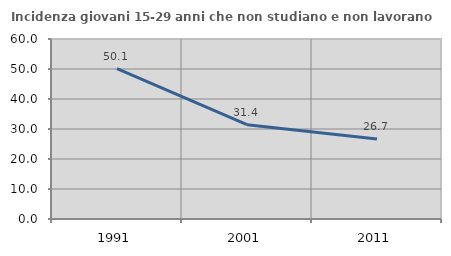
| Category | Incidenza giovani 15-29 anni che non studiano e non lavorano  |
|---|---|
| 1991.0 | 50.097 |
| 2001.0 | 31.429 |
| 2011.0 | 26.667 |